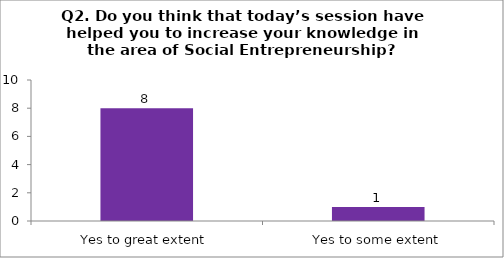
| Category | Q2. Do you think that today’s session have helped you to increase your knowledge in the area of Social Entrepreneurship? |
|---|---|
| Yes to great extent | 8 |
| Yes to some extent | 1 |